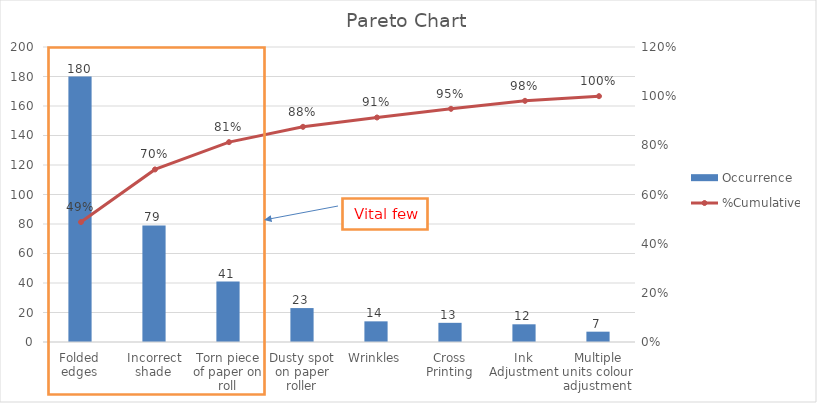
| Category | Occurrence |
|---|---|
| Folded edges | 180 |
| Incorrect shade | 79 |
| Torn piece of paper on roll | 41 |
| Dusty spot on paper roller | 23 |
| Wrinkles | 14 |
| Cross Printing | 13 |
| Ink Adjustment | 12 |
| Multiple units colour adjustment | 7 |